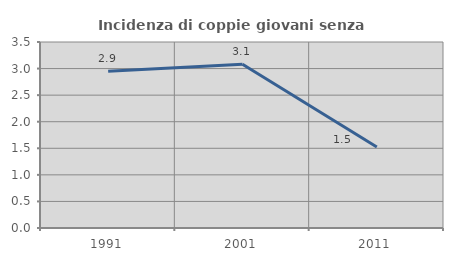
| Category | Incidenza di coppie giovani senza figli |
|---|---|
| 1991.0 | 2.948 |
| 2001.0 | 3.081 |
| 2011.0 | 1.524 |